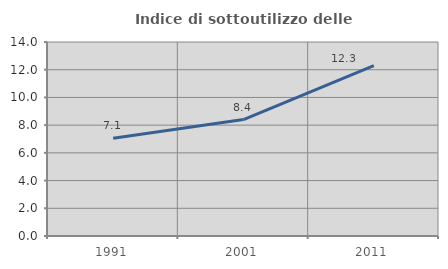
| Category | Indice di sottoutilizzo delle abitazioni  |
|---|---|
| 1991.0 | 7.051 |
| 2001.0 | 8.403 |
| 2011.0 | 12.296 |